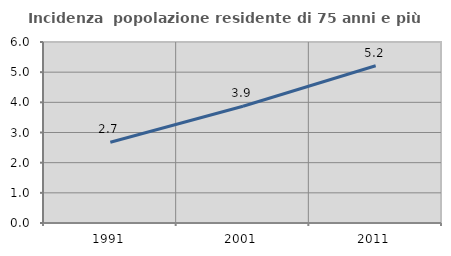
| Category | Incidenza  popolazione residente di 75 anni e più |
|---|---|
| 1991.0 | 2.679 |
| 2001.0 | 3.869 |
| 2011.0 | 5.212 |